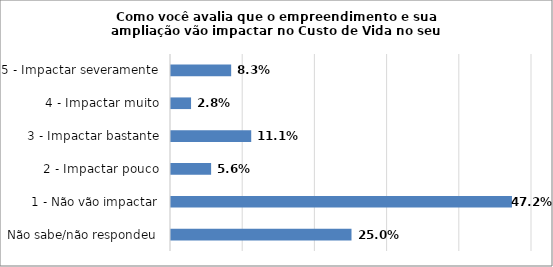
| Category | Series 0 |
|---|---|
| Não sabe/não respondeu | 0.25 |
| 1 - Não vão impactar | 0.472 |
| 2 - Impactar pouco | 0.056 |
| 3 - Impactar bastante | 0.111 |
| 4 - Impactar muito | 0.028 |
| 5 - Impactar severamente | 0.083 |